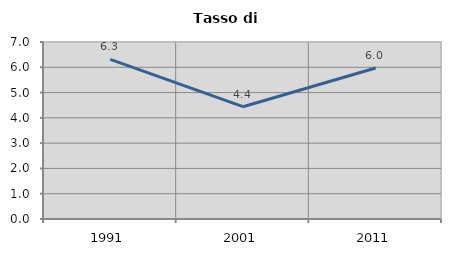
| Category | Tasso di disoccupazione   |
|---|---|
| 1991.0 | 6.311 |
| 2001.0 | 4.441 |
| 2011.0 | 5.971 |